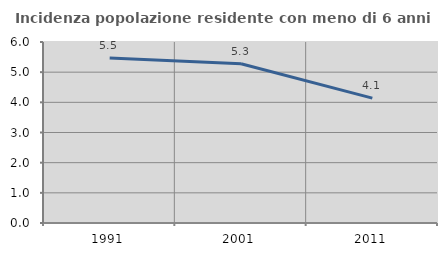
| Category | Incidenza popolazione residente con meno di 6 anni |
|---|---|
| 1991.0 | 5.474 |
| 2001.0 | 5.279 |
| 2011.0 | 4.139 |